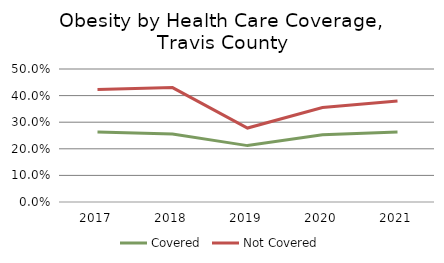
| Category | Covered | Not Covered |
|---|---|---|
| 2017.0 | 0.263 | 0.423 |
| 2018.0 | 0.256 | 0.43 |
| 2019.0 | 0.212 | 0.278 |
| 2020.0 | 0.253 | 0.355 |
| 2021.0 | 0.263 | 0.38 |